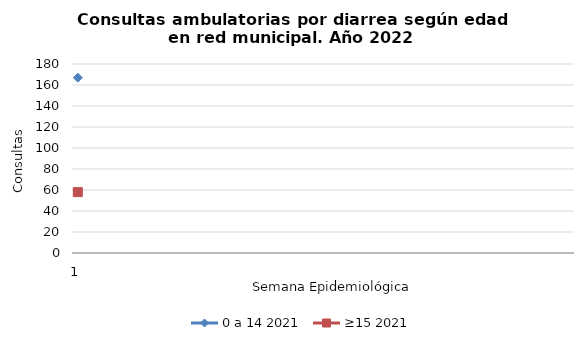
| Category | 0 a 14 2021 | ≥15 2021 |
|---|---|---|
| 1.0 | 167 | 58 |